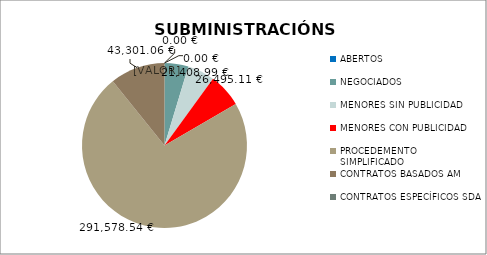
| Category | Series 0 |
|---|---|
| ABERTOS  | 0 |
| NEGOCIADOS  | 18750 |
| MENORES SIN PUBLICIDAD | 21408.99 |
| MENORES CON PUBLICIDAD | 26495.11 |
| PROCEDEMENTO SIMPLIFICADO | 291578.54 |
| CONTRATOS BASADOS AM | 43301.06 |
| CONTRATOS ESPECÍFICOS SDA | 0 |